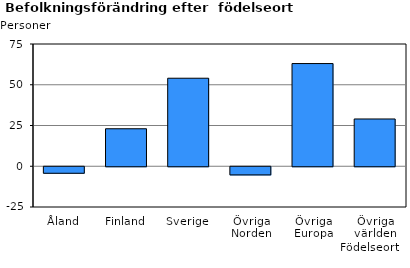
| Category | Series 0 |
|---|---|
| Åland | -4 |
| Finland | 23 |
| Sverige | 54 |
| Övriga Norden | -5 |
| Övriga Europa | 63 |
| Övriga världen | 29 |